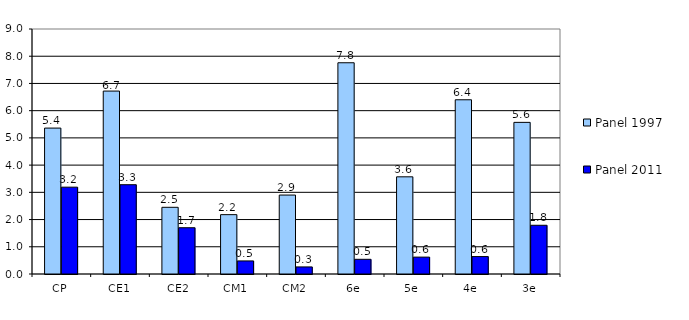
| Category | Panel 1997 | Panel 2011 |
|---|---|---|
| CP | 5.36 | 3.19 |
| CE1 | 6.72 | 3.28 |
| CE2 | 2.45 | 1.7 |
| CM1 | 2.18 | 0.48 |
| CM2 | 2.9 | 0.26 |
| 6e | 7.76 | 0.54 |
| 5e | 3.57 | 0.62 |
| 4e | 6.4 | 0.64 |
| 3e | 5.57 | 1.79 |